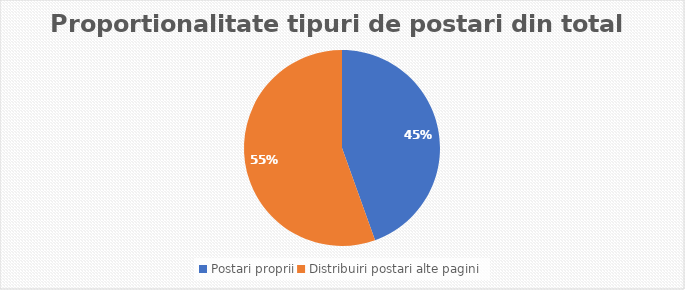
| Category | Series 0 |
|---|---|
| Postari proprii | 61 |
| Distribuiri postari alte pagini | 76 |